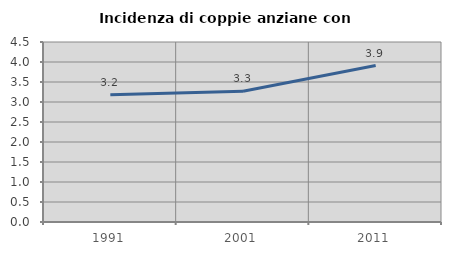
| Category | Incidenza di coppie anziane con figli |
|---|---|
| 1991.0 | 3.184 |
| 2001.0 | 3.266 |
| 2011.0 | 3.911 |